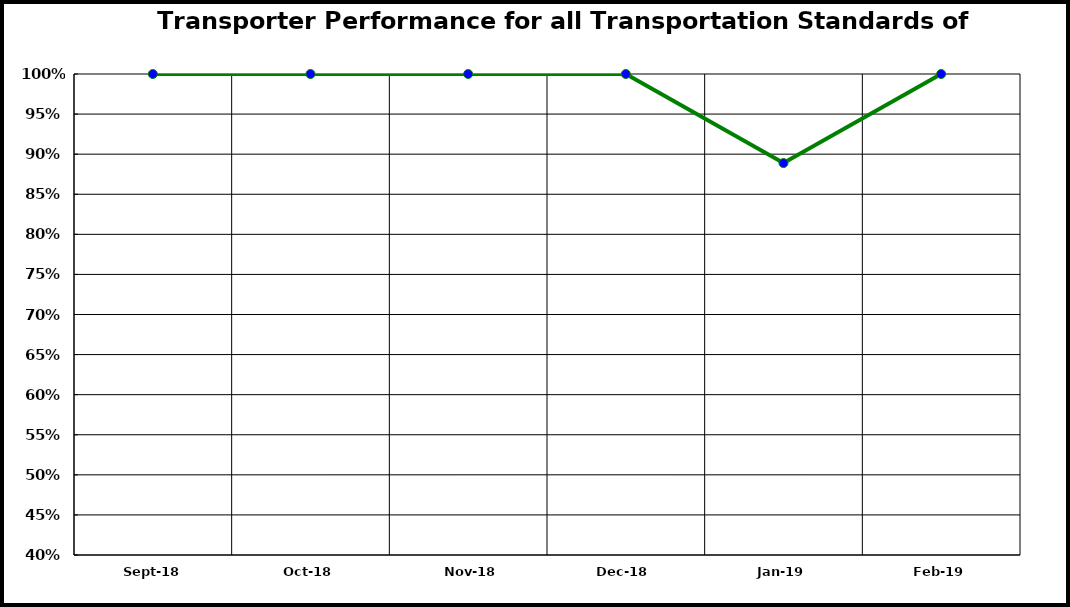
| Category | Performance |
|---|---|
| 2018-09-01 | 1 |
| 2018-10-01 | 1 |
| 2018-11-01 | 1 |
| 2018-12-01 | 1 |
| 2019-01-01 | 0.889 |
| 2019-02-01 | 1 |